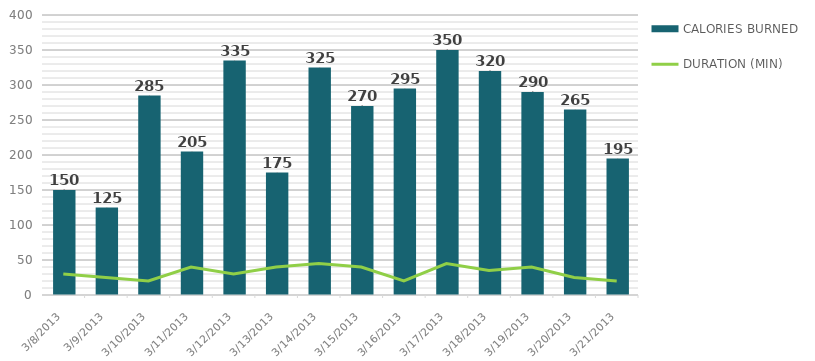
| Category | CALORIES BURNED |
|---|---|
| 3/21/13 | 195 |
| 3/20/13 | 265 |
| 3/19/13 | 290 |
| 3/18/13 | 320 |
| 3/17/13 | 350 |
| 3/16/13 | 295 |
| 3/15/13 | 270 |
| 3/14/13 | 325 |
| 3/13/13 | 175 |
| 3/12/13 | 335 |
| 3/11/13 | 205 |
| 3/10/13 | 285 |
| 3/9/13 | 125 |
| 3/8/13 | 150 |